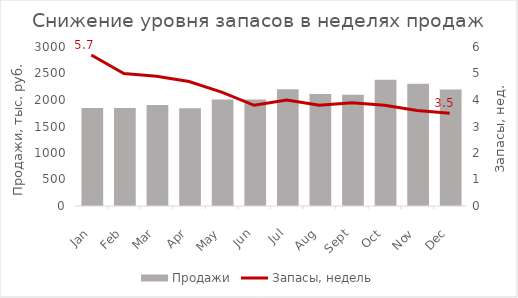
| Category | Продажи |
|---|---|
| 2010-01-01 | 1848 |
| 2010-02-01 | 1849 |
| 2010-03-01 | 1906 |
| 2010-04-01 | 1845 |
| 2010-05-01 | 2011 |
| 2010-06-01 | 2011 |
| 2010-07-01 | 2203 |
| 2010-08-01 | 2114 |
| 2010-09-01 | 2101 |
| 2010-10-01 | 2381 |
| 2010-11-01 | 2308 |
| 2010-12-01 | 2197 |